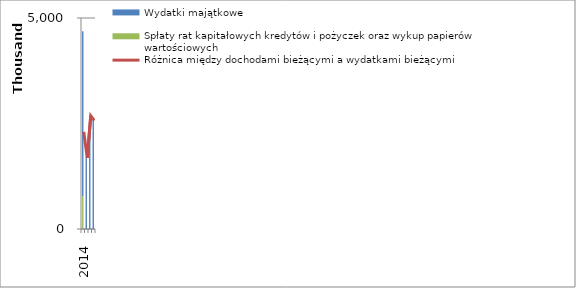
| Category | Spłaty rat kapitałowych kredytów i pożyczek oraz wykup papierów wartościowych | Wydatki majątkowe |
|---|---|---|
| 2014.0 | 773956.19 | 3910500 |
| 2015.0 | 0 | 1685000 |
| 2016.0 | 0 | 2682000 |
| 2017.0 | 0 | 2570000 |